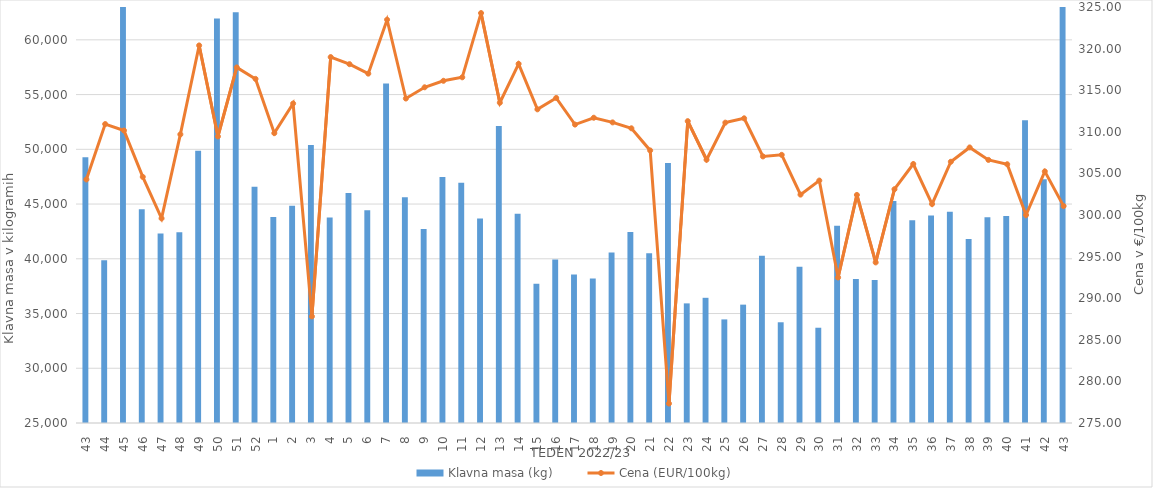
| Category | Klavna masa (kg) |
|---|---|
| 43.0 | 49284 |
| 44.0 | 39877 |
| 45.0 | 63668 |
| 46.0 | 44528 |
| 47.0 | 42319 |
| 48.0 | 42416 |
| 49.0 | 49873 |
| 50.0 | 61942 |
| 51.0 | 62514 |
| 52.0 | 46589 |
| 1.0 | 43807 |
| 2.0 | 44834 |
| 3.0 | 50386 |
| 4.0 | 43773 |
| 5.0 | 46011 |
| 6.0 | 44439 |
| 7.0 | 56001 |
| 8.0 | 45613 |
| 9.0 | 42730 |
| 10.0 | 47471 |
| 11.0 | 46952 |
| 12.0 | 43683 |
| 13.0 | 52135 |
| 14.0 | 44103 |
| 15.0 | 37719 |
| 16.0 | 39943 |
| 17.0 | 38574 |
| 18.0 | 38200 |
| 19.0 | 40581 |
| 20.0 | 42443 |
| 21.0 | 40517 |
| 22.0 | 48742 |
| 23.0 | 35927 |
| 24.0 | 36436 |
| 25.0 | 34463 |
| 26.0 | 35812 |
| 27.0 | 40280 |
| 28.0 | 34201 |
| 29.0 | 39279 |
| 30.0 | 33702 |
| 31.0 | 43020 |
| 32.0 | 38146 |
| 33.0 | 38070 |
| 34.0 | 45290 |
| 35.0 | 43513 |
| 36.0 | 43945 |
| 37.0 | 44302 |
| 38.0 | 41798 |
| 39.0 | 43790 |
| 40.0 | 43913 |
| 41.0 | 52663 |
| 42.0 | 47275 |
| 43.0 | 68419 |